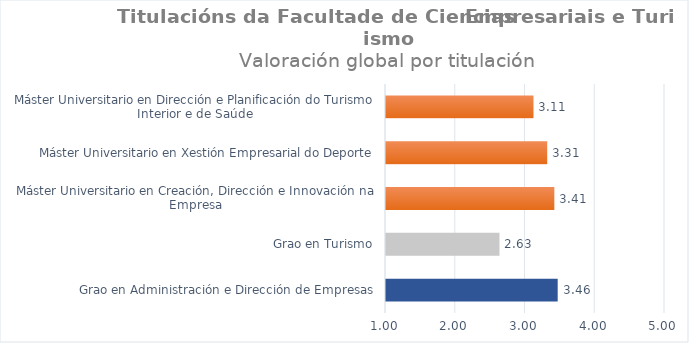
| Category | Series 0 |
|---|---|
| Grao en Administración e Dirección de Empresas | 3.461 |
| Grao en Turismo | 2.627 |
| Máster Universitario en Creación, Dirección e Innovación na Empresa | 3.413 |
| Máster Universitario en Xestión Empresarial do Deporte | 3.311 |
| Máster Universitario en Dirección e Planificación do Turismo Interior e de Saúde | 3.114 |